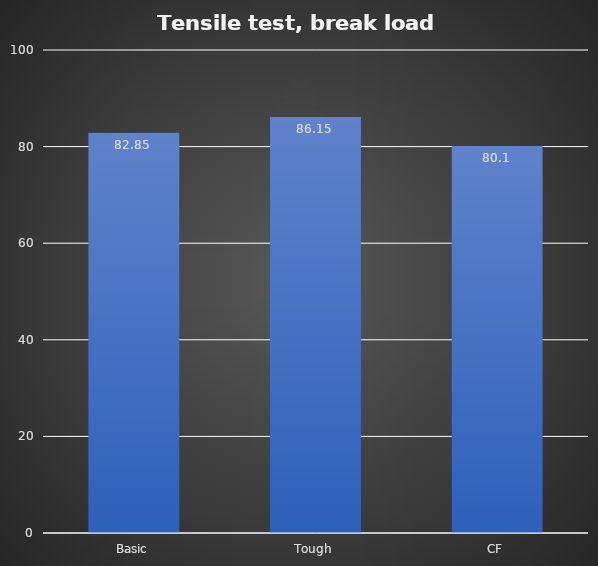
| Category | Average (kg) |
|---|---|
| Basic | 82.85 |
| Tough | 86.15 |
| CF | 80.1 |